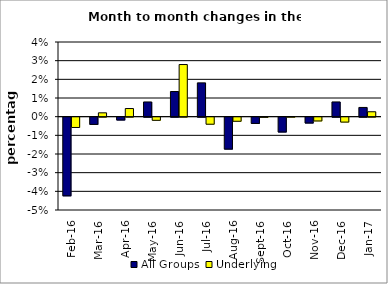
| Category | All Groups | Underlying |
|---|---|---|
| 2016-02-01 | -0.042 | -0.006 |
| 2016-03-01 | -0.004 | 0.002 |
| 2016-04-01 | -0.002 | 0.004 |
| 2016-05-01 | 0.008 | -0.002 |
| 2016-06-01 | 0.013 | 0.028 |
| 2016-07-01 | 0.018 | -0.004 |
| 2016-08-01 | -0.017 | -0.002 |
| 2016-09-01 | -0.003 | 0 |
| 2016-10-01 | -0.008 | 0 |
| 2016-11-01 | -0.003 | -0.002 |
| 2016-12-01 | 0.008 | -0.003 |
| 2017-01-01 | 0.005 | 0.003 |